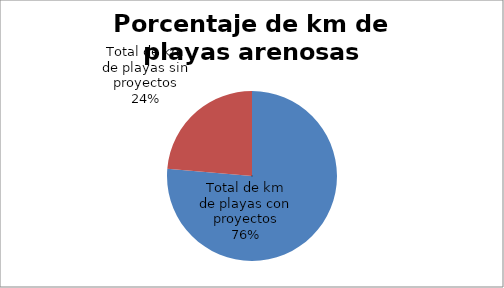
| Category | Series 0 |
|---|---|
| Total de km de playas con proyectos | 76.34 |
| Total de km de playas sin proyectos | 23.66 |